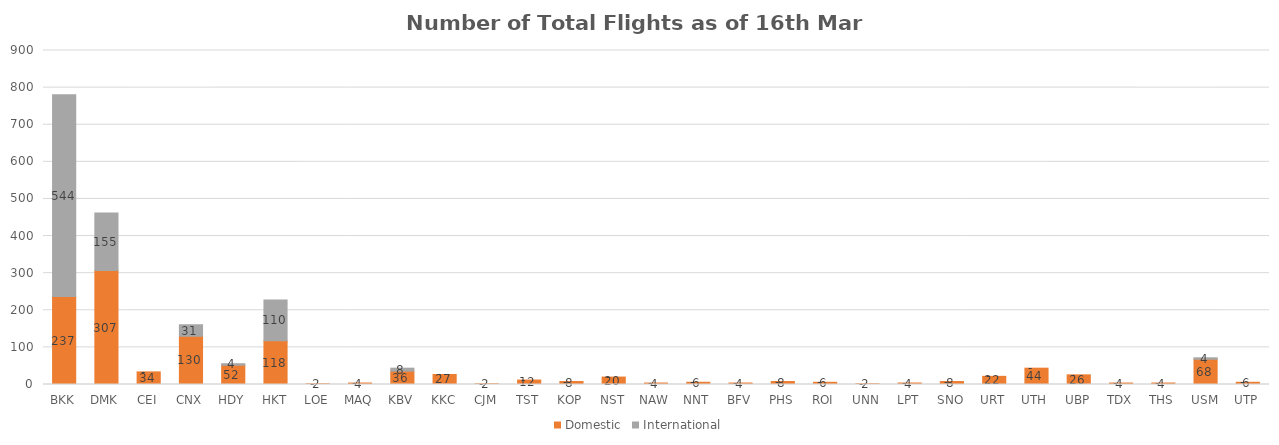
| Category | Domestic | International |
|---|---|---|
| BKK | 237 | 544 |
| DMK | 307 | 155 |
| CEI | 34 | 0 |
| CNX | 130 | 31 |
| HDY | 52 | 4 |
| HKT | 118 | 110 |
| LOE | 2 | 0 |
| MAQ | 4 | 0 |
| KBV | 36 | 8 |
| KKC | 27 | 0 |
| CJM | 2 | 0 |
| TST | 12 | 0 |
| KOP | 8 | 0 |
| NST | 20 | 0 |
| NAW | 4 | 0 |
| NNT | 6 | 0 |
| BFV | 4 | 0 |
| PHS | 8 | 0 |
| ROI | 6 | 0 |
| UNN | 2 | 0 |
| LPT | 4 | 0 |
| SNO | 8 | 0 |
| URT | 22 | 0 |
| UTH | 44 | 0 |
| UBP | 26 | 0 |
| TDX | 4 | 0 |
| THS | 4 | 0 |
| USM | 68 | 4 |
| UTP | 6 | 0 |